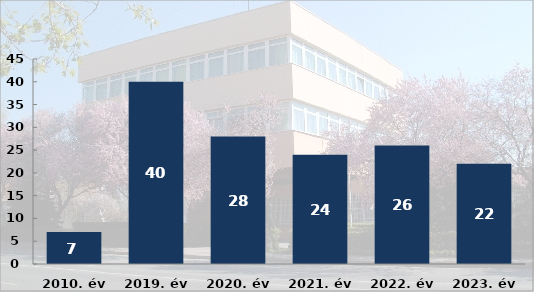
| Category | Büntető feljelentések száma |
|---|---|
| 2010. év | 7 |
| 2019. év | 40 |
| 2020. év | 28 |
| 2021. év | 24 |
| 2022. év | 26 |
| 2023. év | 22 |